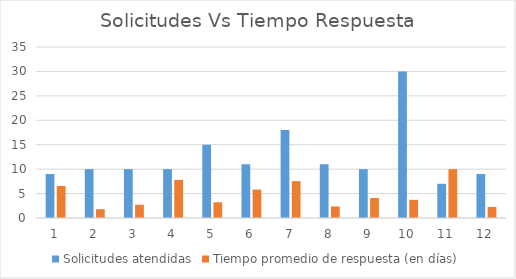
| Category | Solicitudes atendidas | Tiempo promedio de respuesta (en días) |
|---|---|---|
| 0 | 9 | 6.55 |
| 1 | 10 | 1.8 |
| 2 | 10 | 2.71 |
| 3 | 10 | 7.8 |
| 4 | 15 | 3.21 |
| 5 | 11 | 5.81 |
| 6 | 18 | 7.55 |
| 7 | 11 | 2.36 |
| 8 | 10 | 4.1 |
| 9 | 30 | 3.72 |
| 10 | 7 | 10 |
| 11 | 9 | 2.25 |